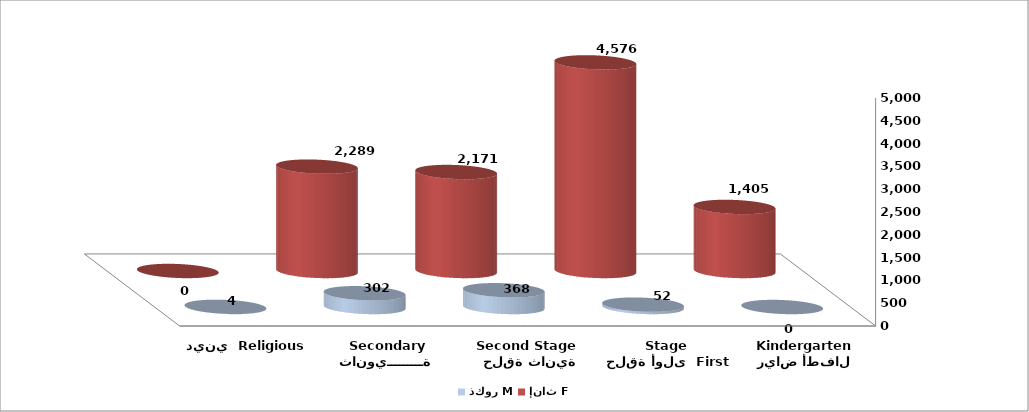
| Category | ذكور M | إناث F |
|---|---|---|
| رياض أطفال Kindergarten | 0 | 1405 |
|  حلقة أولى  First Stage | 52 | 4576 |
|   حلقة ثانية  Second Stage | 368 | 2171 |
| ثانويـــــــــة Secondary | 302 | 2289 |
| ديني  Religious | 4 | 0 |